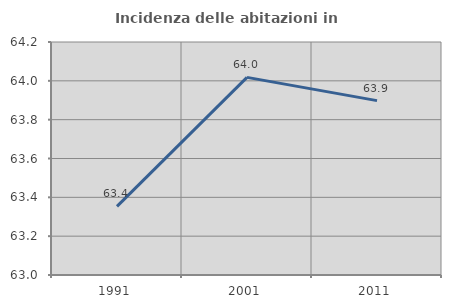
| Category | Incidenza delle abitazioni in proprietà  |
|---|---|
| 1991.0 | 63.354 |
| 2001.0 | 64.018 |
| 2011.0 | 63.898 |